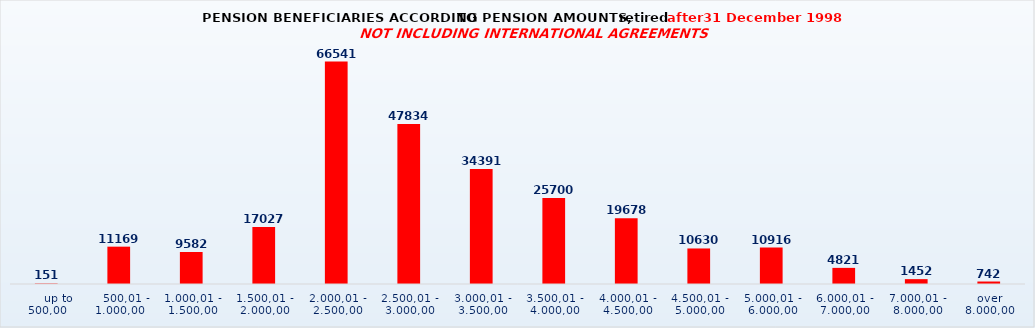
| Category | Series 0 |
|---|---|
|      up to 500,00 | 151 |
|    500,01 - 1.000,00 | 11169 |
| 1.000,01 - 1.500,00 | 9582 |
| 1.500,01 - 2.000,00 | 17027 |
| 2.000,01 - 2.500,00 | 66541 |
| 2.500,01 - 3.000,00 | 47834 |
| 3.000,01 - 3.500,00 | 34391 |
| 3.500,01 - 4.000,00 | 25700 |
| 4.000,01 - 4.500,00 | 19678 |
| 4.500,01 - 5.000,00 | 10630 |
| 5.000,01 - 6.000,00 | 10916 |
| 6.000,01 - 7.000,00 | 4821 |
| 7.000,01 - 8.000,00 | 1452 |
| over 8.000,00 | 742 |